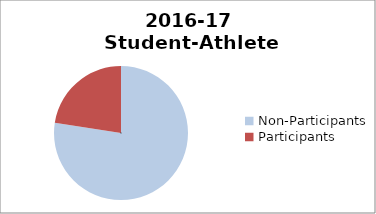
| Category | 2015-16 Student-Athlete Participation (Female) |
|---|---|
| Non-Participants | 866 |
| Participants | 252 |